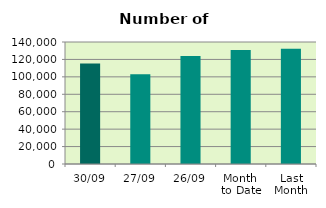
| Category | Series 0 |
|---|---|
| 30/09 | 115400 |
| 27/09 | 102966 |
| 26/09 | 123860 |
| Month 
to Date | 130923.048 |
| Last
Month | 132110.818 |